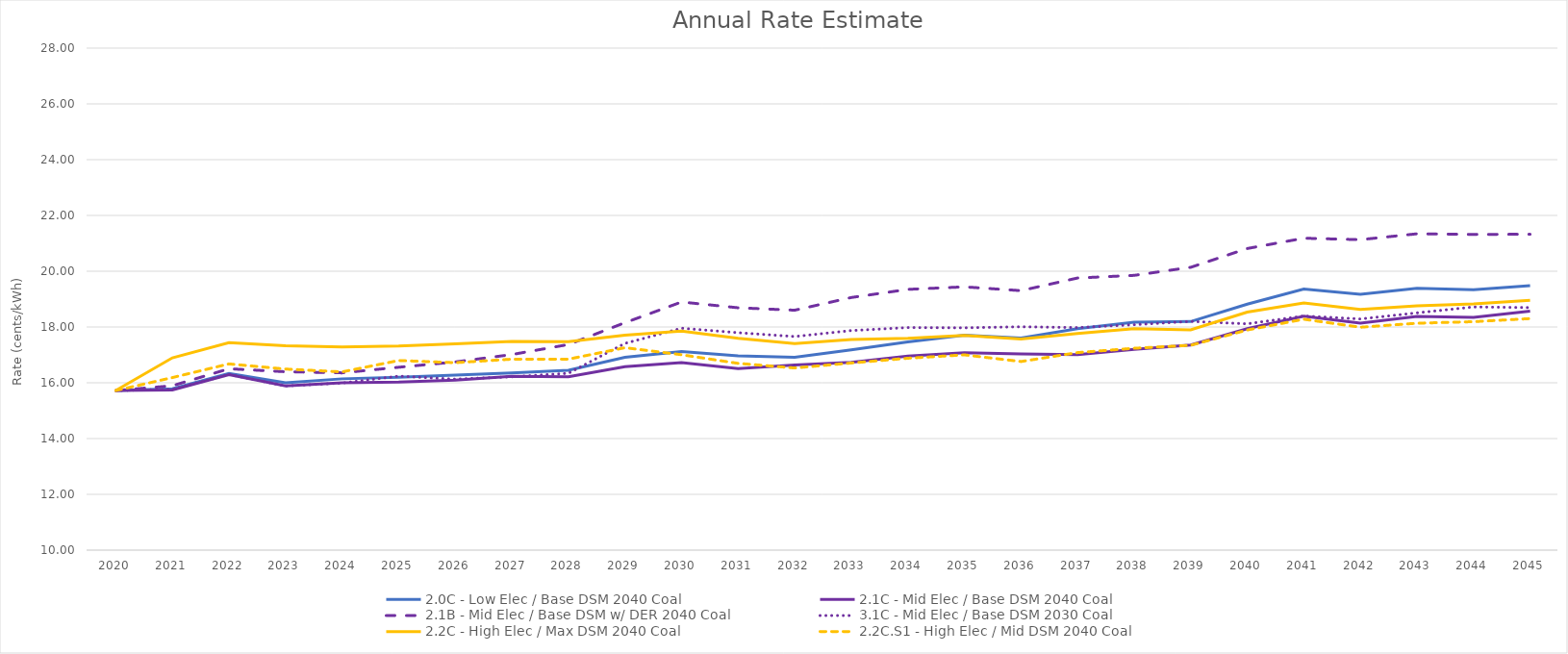
| Category | 2.0C - Low Elec / Base DSM 2040 Coal | 2.1C - Mid Elec / Base DSM 2040 Coal | 2.1B - Mid Elec / Base DSM w/ DER 2040 Coal | 3.1C - Mid Elec / Base DSM 2030 Coal | 2.2C - High Elec / Max DSM 2040 Coal | 2.2C.S1 - High Elec / Mid DSM 2040 Coal |
|---|---|---|---|---|---|---|
| 2020.0 | 15.722 | 15.722 | 15.722 | 15.722 | 15.722 | 15.722 |
| 2021.0 | 15.786 | 15.74 | 15.894 | 15.765 | 16.895 | 16.187 |
| 2022.0 | 16.337 | 16.29 | 16.503 | 16.298 | 17.44 | 16.677 |
| 2023.0 | 15.996 | 15.886 | 16.396 | 15.886 | 17.327 | 16.492 |
| 2024.0 | 16.142 | 16.001 | 16.357 | 15.992 | 17.286 | 16.391 |
| 2025.0 | 16.198 | 16.024 | 16.557 | 16.238 | 17.316 | 16.799 |
| 2026.0 | 16.272 | 16.099 | 16.747 | 16.13 | 17.394 | 16.721 |
| 2027.0 | 16.355 | 16.229 | 17.012 | 16.215 | 17.483 | 16.847 |
| 2028.0 | 16.447 | 16.219 | 17.372 | 16.34 | 17.47 | 16.847 |
| 2029.0 | 16.91 | 16.574 | 18.154 | 17.412 | 17.711 | 17.258 |
| 2030.0 | 17.12 | 16.724 | 18.897 | 17.956 | 17.85 | 17.006 |
| 2031.0 | 16.963 | 16.511 | 18.689 | 17.796 | 17.594 | 16.696 |
| 2032.0 | 16.913 | 16.638 | 18.602 | 17.658 | 17.405 | 16.531 |
| 2033.0 | 17.185 | 16.732 | 19.057 | 17.872 | 17.553 | 16.71 |
| 2034.0 | 17.466 | 16.958 | 19.349 | 17.98 | 17.594 | 16.88 |
| 2035.0 | 17.705 | 17.081 | 19.44 | 17.971 | 17.695 | 17.001 |
| 2036.0 | 17.603 | 17.034 | 19.303 | 18.008 | 17.566 | 16.762 |
| 2037.0 | 17.94 | 17.005 | 19.756 | 17.979 | 17.764 | 17.082 |
| 2038.0 | 18.172 | 17.201 | 19.851 | 18.083 | 17.939 | 17.237 |
| 2039.0 | 18.195 | 17.356 | 20.14 | 18.201 | 17.901 | 17.343 |
| 2040.0 | 18.821 | 17.938 | 20.814 | 18.114 | 18.532 | 17.892 |
| 2041.0 | 19.359 | 18.391 | 21.184 | 18.395 | 18.861 | 18.278 |
| 2042.0 | 19.169 | 18.135 | 21.131 | 18.288 | 18.633 | 17.991 |
| 2043.0 | 19.385 | 18.376 | 21.342 | 18.507 | 18.759 | 18.135 |
| 2044.0 | 19.335 | 18.344 | 21.321 | 18.719 | 18.831 | 18.191 |
| 2045.0 | 19.479 | 18.565 | 21.325 | 18.695 | 18.954 | 18.301 |